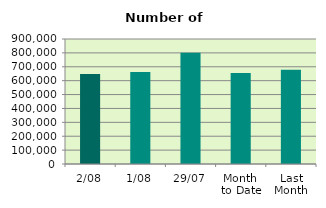
| Category | Series 0 |
|---|---|
| 2/08 | 648046 |
| 1/08 | 662450 |
| 29/07 | 800760 |
| Month 
to Date | 655248 |
| Last
Month | 677996.667 |